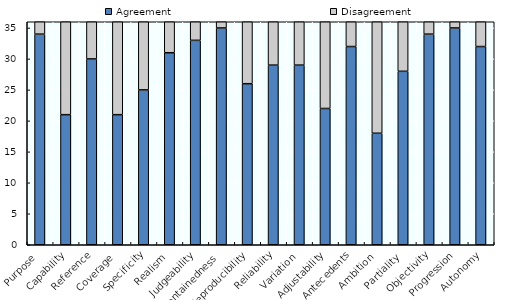
| Category | Agreement | Disagreement |
|---|---|---|
| Purpose | 34 | 2 |
| Capability | 21 | 15 |
| Reference | 30 | 6 |
| Coverage  | 21 | 15 |
| Specificity | 25 | 11 |
| Realism | 31 | 5 |
| Judgeability | 33 | 3 |
| Containedness | 35 | 1 |
| Reproducibility | 26 | 10 |
| Reliability | 29 | 7 |
| Variation | 29 | 7 |
| Adjustability | 22 | 14 |
| Antecedents | 32 | 4 |
| Ambition | 18 | 18 |
| Partiality | 28 | 8 |
| Objectivity | 34 | 2 |
| Progression | 35 | 1 |
| Autonomy | 32 | 4 |